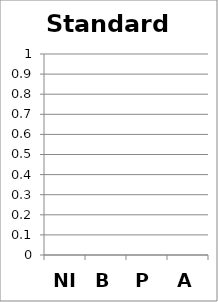
| Category | Standard 3 | Standard 4 |
|---|---|---|
| NI | 0 | 0 |
| B | 0 | 0 |
| P | 0 | 0 |
| A | 0 | 0 |